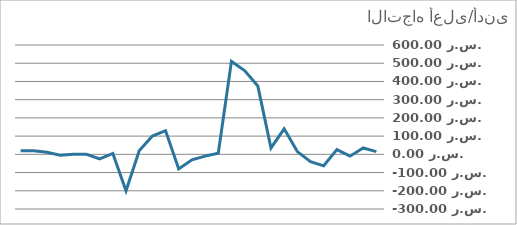
| Category | الفرق |
|---|---|
| 0 | 15 |
| 1 | 35 |
| 2 | -10 |
| 3 | 26 |
| 4 | -63 |
| 5 | -40 |
| 6 | 15 |
| 7 | 140 |
| 8 | 35 |
| 9 | 375 |
| 10 | 460 |
| 11 | 510 |
| 12 | 6 |
| 13 | -10 |
| 14 | -30 |
| 15 | -80 |
| 16 | 130 |
| 17 | 100 |
| 18 | 20 |
| 19 | -200 |
| 20 | 5 |
| 21 | -25 |
| 22 | 0 |
| 23 | 1 |
| 24 | -5 |
| 25 | 11 |
| 26 | 20 |
| 27 | 20 |